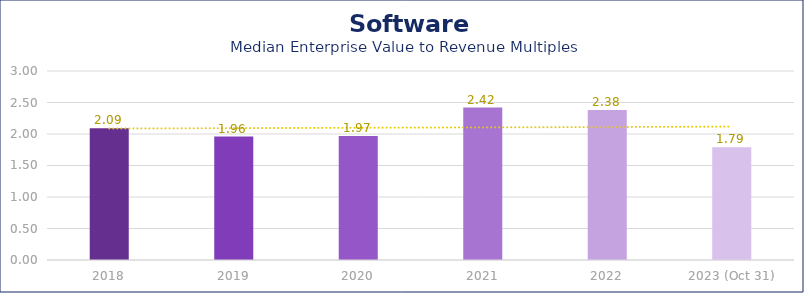
| Category | Software |
|---|---|
| 2018 | 2.09 |
| 2019 | 1.96 |
| 2020 | 1.97 |
| 2021 | 2.42 |
| 2022 | 2.38 |
| 2023 (Oct 31) | 1.79 |